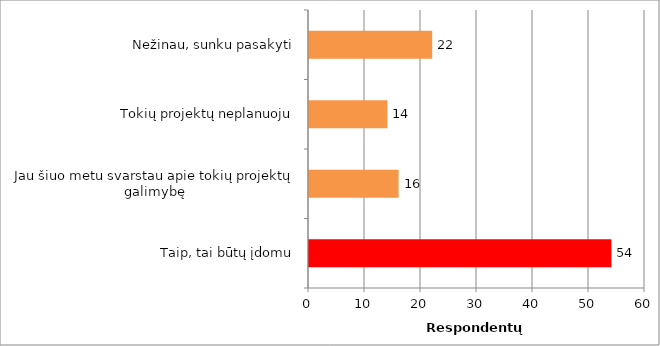
| Category | Series 0 |
|---|---|
| Taip, tai būtų įdomu | 54 |
| Jau šiuo metu svarstau apie tokių projektų galimybę | 16 |
| Tokių projektų neplanuoju | 14 |
| Nežinau, sunku pasakyti | 22 |